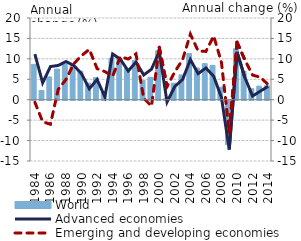
| Category | World |
|---|---|
| 1984.0 | 8.656 |
| 1985.0 | 2.258 |
| 1986.0 | 5.585 |
| 1987.0 | 7.497 |
| 1988.0 | 8.695 |
| 1989.0 | 8.462 |
| 1990.0 | 6.997 |
| 1991.0 | 4.067 |
| 1992.0 | 5.371 |
| 1993.0 | 1.816 |
| 1994.0 | 10.128 |
| 1995.0 | 10.026 |
| 1996.0 | 7.603 |
| 1997.0 | 9.621 |
| 1998.0 | 4.763 |
| 1999.0 | 5.479 |
| 2000.0 | 11.991 |
| 2001.0 | 0.242 |
| 2002.0 | 4.041 |
| 2003.0 | 6.066 |
| 2004.0 | 11.289 |
| 2005.0 | 7.759 |
| 2006.0 | 8.834 |
| 2007.0 | 8.408 |
| 2008.0 | 3.04 |
| 2009.0 | -10.856 |
| 2010.0 | 12.48 |
| 2011.0 | 6.936 |
| 2012.0 | 2.686 |
| 2013.0 | 3.33 |
| 2014.0 | 3.43 |